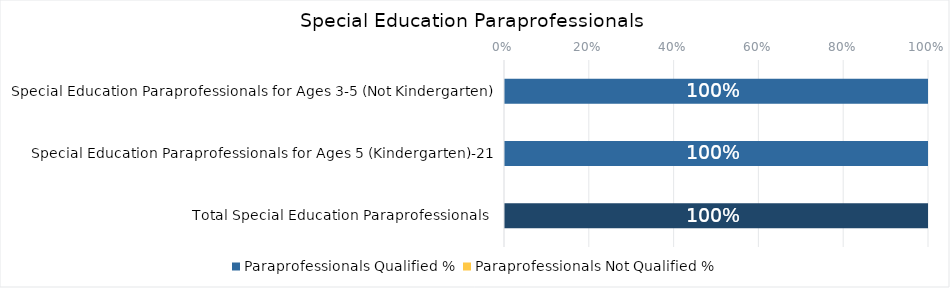
| Category | Paraprofessionals Qualified % | Paraprofessionals Not Qualified % |
|---|---|---|
| Special Education Paraprofessionals for Ages 3-5 (Not Kindergarten) | 1 | 0 |
| Special Education Paraprofessionals for Ages 5 (Kindergarten)-21 | 1 | 0 |
| Total Special Education Paraprofessionals  | 1 | 0 |